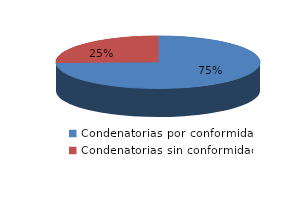
| Category | Series 0 |
|---|---|
| 0 | 540 |
| 1 | 184 |